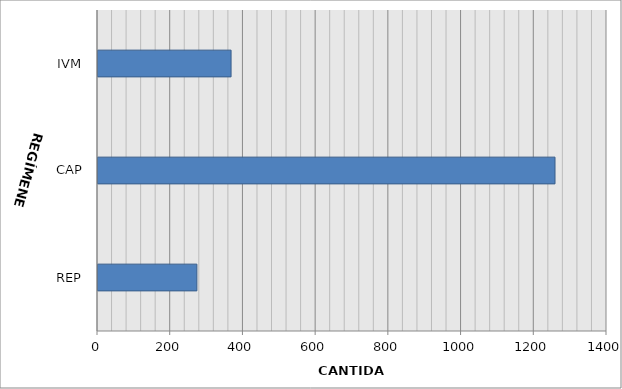
| Category | Series 0 |
|---|---|
| REP | 272 |
| CAP | 1257 |
| IVM | 366 |